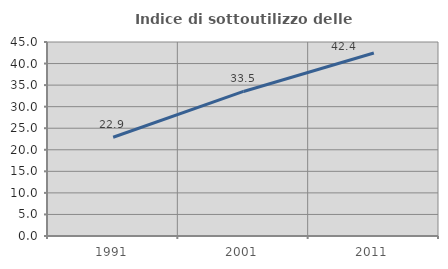
| Category | Indice di sottoutilizzo delle abitazioni  |
|---|---|
| 1991.0 | 22.914 |
| 2001.0 | 33.53 |
| 2011.0 | 42.442 |